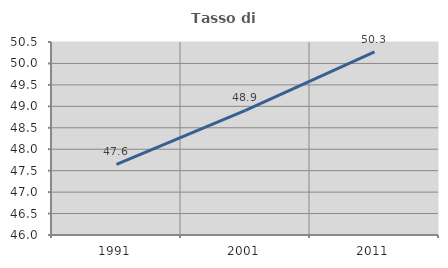
| Category | Tasso di occupazione   |
|---|---|
| 1991.0 | 47.646 |
| 2001.0 | 48.904 |
| 2011.0 | 50.268 |